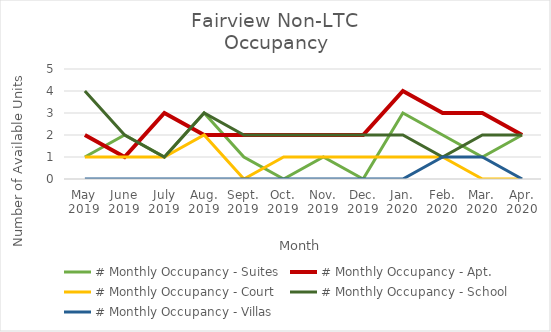
| Category | # Monthly Occupancy - Suites | # Monthly Occupancy - Apt. | # Monthly Occupancy - Court | # Monthly Occupancy - School | # Monthly Occupancy - Villas |
|---|---|---|---|---|---|
| May
2019 | 1 | 2 | 1 | 4 | 0 |
| June
2019 | 2 | 1 | 1 | 2 | 0 |
| July
2019 | 1 | 3 | 1 | 1 | 0 |
| Aug.
2019 | 3 | 2 | 2 | 3 | 0 |
| Sept.
2019 | 1 | 2 | 0 | 2 | 0 |
| Oct.
2019 | 0 | 2 | 1 | 2 | 0 |
| Nov.
2019 | 1 | 2 | 1 | 2 | 0 |
| Dec.
2019 | 0 | 2 | 1 | 2 | 0 |
| Jan.
2020 | 3 | 4 | 1 | 2 | 0 |
| Feb.
2020 | 2 | 3 | 1 | 1 | 1 |
| Mar.
2020 | 1 | 3 | 0 | 2 | 1 |
| Apr.
2020 | 2 | 2 | 0 | 2 | 0 |